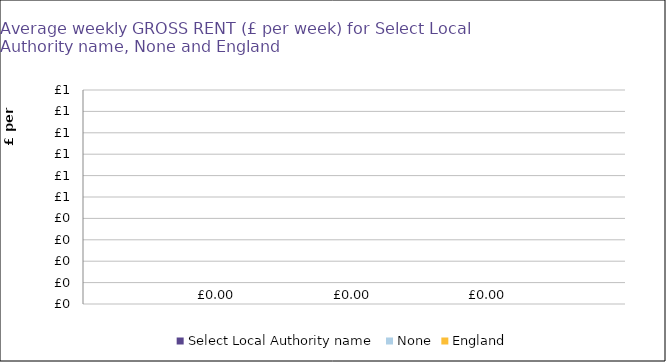
| Category | Select Local Authority name | None | England |
|---|---|---|---|
| 0 | 0 | 0 | 0 |